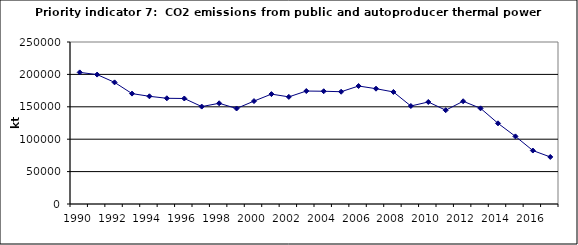
| Category | CO2 emissions from public and autoproducer thermal power stations, kt |
|---|---|
| 1990 | 203115.85 |
| 1991 | 199721.534 |
| 1992 | 187714.379 |
| 1993 | 170373.17 |
| 1994 | 166199.335 |
| 1995 | 163145.428 |
| 1996 | 162822.57 |
| 1997 | 150321.241 |
| 1998 | 155426.507 |
| 1999 | 147395.71 |
| 2000 | 158823.564 |
| 2001 | 169590.664 |
| 2002 | 165294.088 |
| 2003 | 174330.216 |
| 2004 | 174017.597 |
| 2005 | 173273.013 |
| 2006 | 182075.645 |
| 2007 | 177933.04 |
| 2008 | 172932.553 |
| 2009 | 151215.65 |
| 2010 | 157455.009 |
| 2011 | 144738.835 |
| 2012 | 158559.244 |
| 2013 | 147644.747 |
| 2014 | 124513.313 |
| 2015 | 104336.22 |
| 2016 | 82490.147 |
| 2017 | 72598.014 |